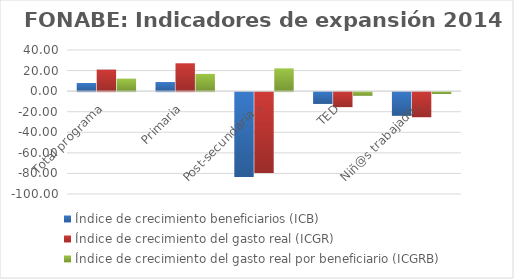
| Category | Índice de crecimiento beneficiarios (ICB)  | Índice de crecimiento del gasto real (ICGR)  | Índice de crecimiento del gasto real por beneficiario (ICGRB)  |
|---|---|---|---|
| Total programa | 7.919 | 20.946 | 12.071 |
| Primaria | 8.855 | 27.088 | 16.75 |
| Post-secundaria Regular | -82.385 | -78.49 | 22.113 |
| TED | -11.468 | -14.595 | -3.533 |
| Niñ@s trabajadores | -23.03 | -24.439 | -1.83 |